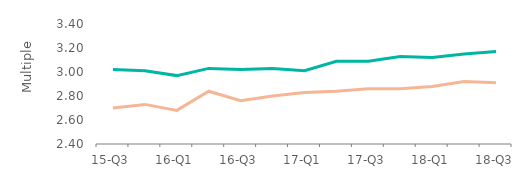
| Category | First-time
buyers | Home movers |
|---|---|---|
| 15-Q3 | 3.02 | 2.7 |
| 15-Q4 | 3.01 | 2.73 |
| 16-Q1 | 2.97 | 2.68 |
| 16-Q2 | 3.03 | 2.84 |
| 16-Q3 | 3.02 | 2.76 |
| 16-Q4 | 3.03 | 2.8 |
| 17-Q1 | 3.01 | 2.83 |
| 17-Q2 | 3.09 | 2.84 |
| 17-Q3 | 3.09 | 2.86 |
| 17-Q4 | 3.13 | 2.86 |
| 18-Q1 | 3.12 | 2.88 |
| 18-Q2 | 3.15 | 2.92 |
| 18-Q3 | 3.17 | 2.91 |